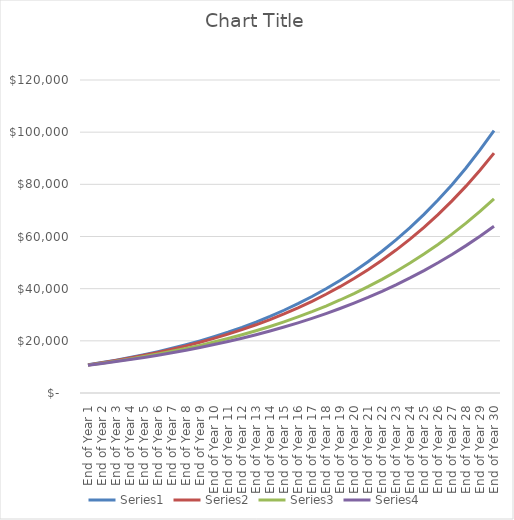
| Category | Series 0 | Series 1 | Series 2 | Series 3 |
|---|---|---|---|---|
| End of Year 1 | 10800 | 10767.6 | 10692 | 10638 |
| End of Year 2 | 11664 | 11594.121 | 11431.886 | 11316.704 |
| End of Year 3 | 12597.12 | 12484.086 | 12222.973 | 12038.71 |
| End of Year 4 | 13604.89 | 13442.364 | 13068.803 | 12806.78 |
| End of Year 5 | 14693.281 | 14474.2 | 13973.164 | 13623.852 |
| End of Year 6 | 15868.743 | 15585.24 | 14940.107 | 14493.054 |
| End of Year 7 | 17138.243 | 16781.563 | 15973.962 | 15417.711 |
| End of Year 8 | 18509.302 | 18069.715 | 17079.36 | 16401.361 |
| End of Year 9 | 19990.046 | 19456.747 | 18261.252 | 17447.768 |
| End of Year 10 | 21589.25 | 20950.247 | 19524.931 | 18560.935 |
| End of Year 11 | 23316.39 | 22558.387 | 20876.056 | 19745.123 |
| End of Year 12 | 25181.701 | 24289.969 | 22320.679 | 21004.862 |
| End of Year 13 | 27196.237 | 26154.467 | 23865.27 | 22344.972 |
| End of Year 14 | 29371.936 | 28162.084 | 25516.747 | 23770.581 |
| End of Year 15 | 31721.691 | 30323.806 | 27282.505 | 25287.144 |
| End of Year 16 | 34259.426 | 32651.461 | 29170.455 | 26900.464 |
| End of Year 17 | 37000.181 | 35157.787 | 31189.05 | 28616.714 |
| End of Year 18 | 39960.195 | 37856.499 | 33347.333 | 30442.46 |
| End of Year 19 | 43157.011 | 40762.364 | 35654.968 | 32384.689 |
| End of Year 20 | 46609.571 | 43891.283 | 38122.292 | 34450.832 |
| End of Year 21 | 50338.337 | 47260.378 | 40760.354 | 36648.795 |
| End of Year 22 | 54365.404 | 50888.084 | 43580.971 | 38986.989 |
| End of Year 23 | 58714.636 | 54794.254 | 46596.774 | 41474.359 |
| End of Year 24 | 63411.807 | 59000.261 | 49821.271 | 44120.423 |
| End of Year 25 | 68484.752 | 63529.121 | 53268.903 | 46935.306 |
| End of Year 26 | 73963.532 | 68405.616 | 56955.111 | 49929.778 |
| End of Year 27 | 79880.615 | 73656.431 | 60896.405 | 53115.298 |
| End of Year 28 | 86271.064 | 79310.299 | 65110.436 | 56504.054 |
| End of Year 29 | 93172.749 | 85398.157 | 69616.078 | 60109.013 |
| End of Year 30 | 100626.569 | 91953.32 | 74433.511 | 63943.968 |